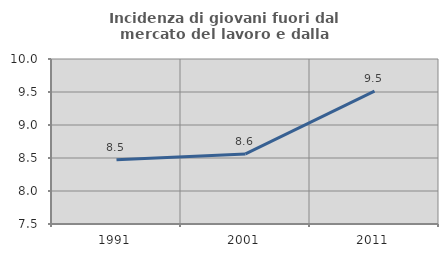
| Category | Incidenza di giovani fuori dal mercato del lavoro e dalla formazione  |
|---|---|
| 1991.0 | 8.475 |
| 2001.0 | 8.562 |
| 2011.0 | 9.515 |